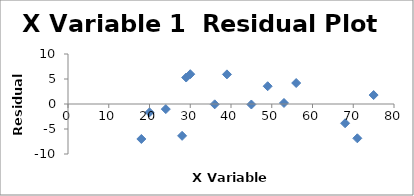
| Category | Series 0 |
|---|---|
| 18.0 | -6.996 |
| 20.0 | -1.671 |
| 24.0 | -1.019 |
| 28.0 | -6.367 |
| 29.0 | 5.296 |
| 30.0 | 5.959 |
| 36.0 | -0.064 |
| 39.0 | 5.925 |
| 45.0 | -0.097 |
| 49.0 | 3.554 |
| 53.0 | 0.206 |
| 56.0 | 4.195 |
| 68.0 | -3.85 |
| 71.0 | -6.861 |
| 75.0 | 1.791 |